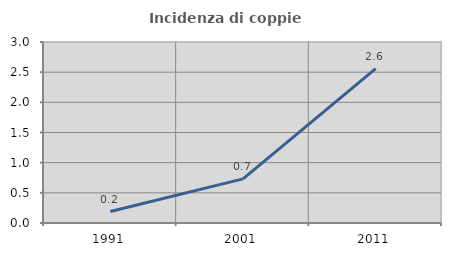
| Category | Incidenza di coppie miste |
|---|---|
| 1991.0 | 0.19 |
| 2001.0 | 0.731 |
| 2011.0 | 2.56 |